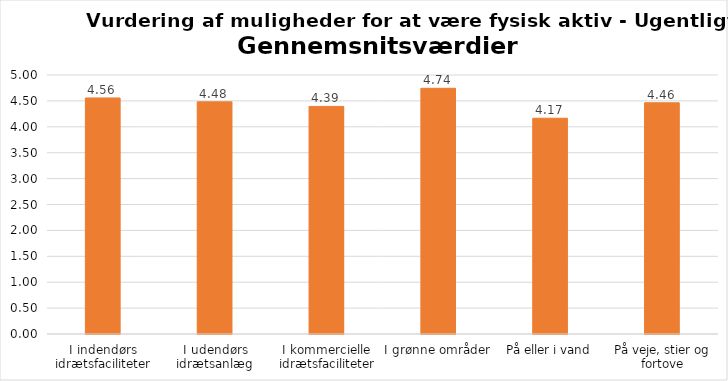
| Category | Gennemsnit |
|---|---|
| I indendørs idrætsfaciliteter | 4.557 |
| I udendørs idrætsanlæg | 4.482 |
| I kommercielle idrætsfaciliteter | 4.393 |
| I grønne områder | 4.744 |
| På eller i vand | 4.165 |
| På veje, stier og fortove | 4.464 |